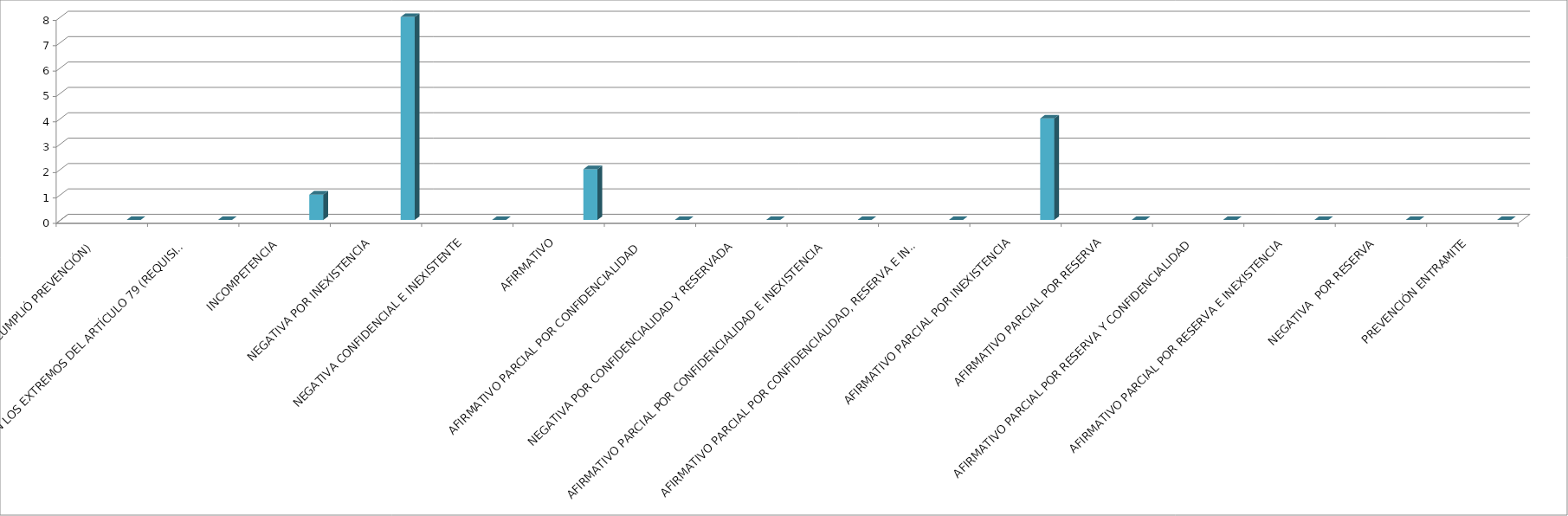
| Category | Series 0 | Series 1 | Series 2 | Series 3 | Series 4 |
|---|---|---|---|---|---|
| SE TIENE POR NO PRESENTADA ( NO CUMPLIÓ PREVENCIÓN) |  |  |  |  | 0 |
| NO CUMPLIO CON LOS EXTREMOS DEL ARTÍCULO 79 (REQUISITOS) |  |  |  |  | 0 |
| INCOMPETENCIA  |  |  |  |  | 1 |
| NEGATIVA POR INEXISTENCIA |  |  |  |  | 8 |
| NEGATIVA CONFIDENCIAL E INEXISTENTE |  |  |  |  | 0 |
| AFIRMATIVO |  |  |  |  | 2 |
| AFIRMATIVO PARCIAL POR CONFIDENCIALIDAD  |  |  |  |  | 0 |
| NEGATIVA POR CONFIDENCIALIDAD Y RESERVADA |  |  |  |  | 0 |
| AFIRMATIVO PARCIAL POR CONFIDENCIALIDAD E INEXISTENCIA |  |  |  |  | 0 |
| AFIRMATIVO PARCIAL POR CONFIDENCIALIDAD, RESERVA E INEXISTENCIA |  |  |  |  | 0 |
| AFIRMATIVO PARCIAL POR INEXISTENCIA |  |  |  |  | 4 |
| AFIRMATIVO PARCIAL POR RESERVA |  |  |  |  | 0 |
| AFIRMATIVO PARCIAL POR RESERVA Y CONFIDENCIALIDAD |  |  |  |  | 0 |
| AFIRMATIVO PARCIAL POR RESERVA E INEXISTENCIA |  |  |  |  | 0 |
| NEGATIVA  POR RESERVA |  |  |  |  | 0 |
| PREVENCIÓN ENTRAMITE |  |  |  |  | 0 |